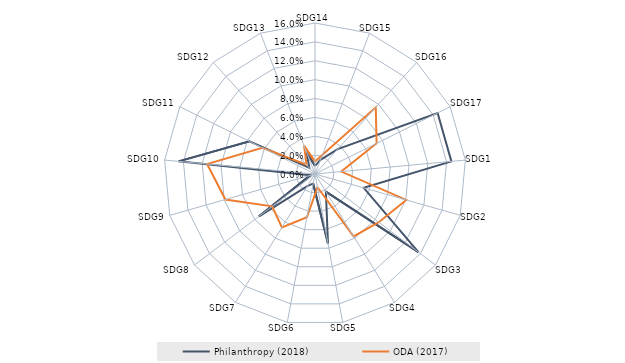
| Category | Philanthropy (2018) | ODA (2017) |
|---|---|---|
| SDG14 | 0.009 | 0.013 |
| SDG15 | 0.016 | 0.022 |
| SDG16 | 0.036 | 0.096 |
| SDG17 | 0.145 | 0.073 |
| SDG1 | 0.145 | 0.028 |
| SDG2 | 0.054 | 0.1 |
| SDG3 | 0.137 | 0.085 |
| SDG4 | 0.022 | 0.078 |
| SDG5 | 0.075 | 0.014 |
| SDG6 | 0.01 | 0.047 |
| SDG7 | 0.015 | 0.067 |
| SDG8 | 0.074 | 0.057 |
| SDG9 | 0.005 | 0.099 |
| SDG10 | 0.145 | 0.115 |
| SDG11 | 0.078 | 0.062 |
| SDG12 | 0.009 | 0.013 |
| SDG13 | 0.025 | 0.032 |